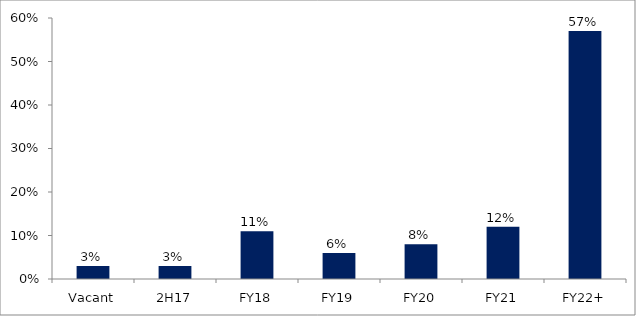
| Category | Series 0 |
|---|---|
| Vacant | 0.03 |
| 2H17 | 0.03 |
| FY18 | 0.11 |
| FY19 | 0.06 |
| FY20 | 0.08 |
| FY21 | 0.12 |
| FY22+ | 0.57 |